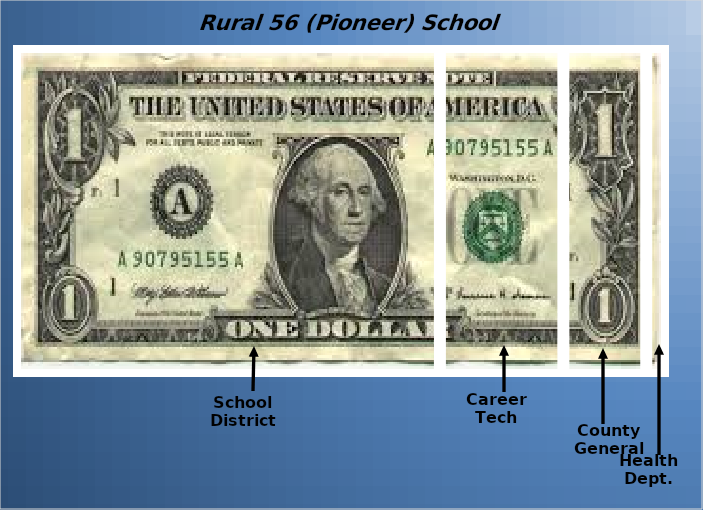
| Category | School District | Career Tech | County General | Health Dept. |
|---|---|---|---|---|
| 0 | 0.652 | 0.189 | 0.127 | 0.032 |